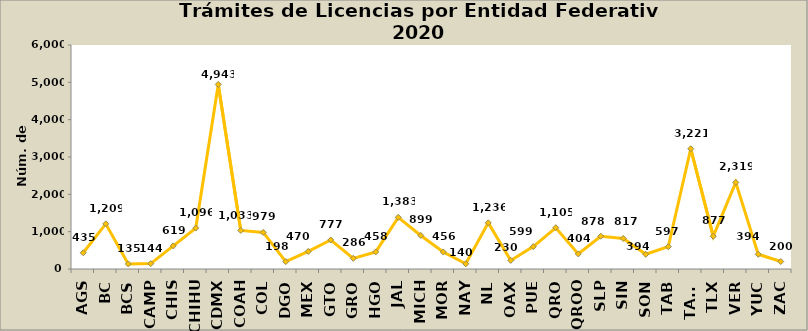
| Category | Series 0 |
|---|---|
| AGS | 435 |
| BC | 1209 |
| BCS | 135 |
| CAMP | 144 |
| CHIS | 619 |
| CHIHU | 1096 |
| CDMX | 4943 |
| COAH | 1033 |
| COL | 979 |
| DGO | 198 |
| MEX | 470 |
| GTO | 777 |
| GRO | 286 |
| HGO | 458 |
| JAL | 1383 |
| MICH | 899 |
| MOR | 456 |
| NAY | 140 |
| NL | 1236 |
| OAX | 230 |
| PUE | 599 |
| QRO | 1105 |
| QROO | 404 |
| SLP | 878 |
| SIN | 817 |
| SON | 394 |
| TAB | 597 |
| TAMS | 3221 |
| TLX | 877 |
| VER | 2319 |
| YUC | 394 |
| ZAC | 200 |